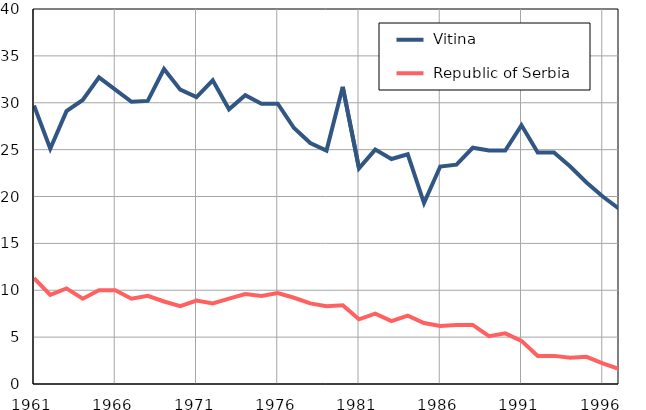
| Category |  Vitina |  Republic of Serbia |
|---|---|---|
| 1961.0 | 29.7 | 11.3 |
| 1962.0 | 25.1 | 9.5 |
| 1963.0 | 29.1 | 10.2 |
| 1964.0 | 30.3 | 9.1 |
| 1965.0 | 32.7 | 10 |
| 1966.0 | 31.4 | 10 |
| 1967.0 | 30.1 | 9.1 |
| 1968.0 | 30.2 | 9.4 |
| 1969.0 | 33.6 | 8.8 |
| 1970.0 | 31.4 | 8.3 |
| 1971.0 | 30.6 | 8.9 |
| 1972.0 | 32.4 | 8.6 |
| 1973.0 | 29.3 | 9.1 |
| 1974.0 | 30.8 | 9.6 |
| 1975.0 | 29.9 | 9.4 |
| 1976.0 | 29.9 | 9.7 |
| 1977.0 | 27.3 | 9.2 |
| 1978.0 | 25.7 | 8.6 |
| 1979.0 | 24.9 | 8.3 |
| 1980.0 | 31.7 | 8.4 |
| 1981.0 | 23 | 6.9 |
| 1982.0 | 25 | 7.5 |
| 1983.0 | 24 | 6.7 |
| 1984.0 | 24.5 | 7.3 |
| 1985.0 | 19.3 | 6.5 |
| 1986.0 | 23.2 | 6.2 |
| 1987.0 | 23.4 | 6.3 |
| 1988.0 | 25.2 | 6.3 |
| 1989.0 | 24.9 | 5.1 |
| 1990.0 | 24.9 | 5.4 |
| 1991.0 | 27.6 | 4.6 |
| 1992.0 | 24.7 | 3 |
| 1993.0 | 24.7 | 3 |
| 1994.0 | 23.2 | 2.8 |
| 1995.0 | 21.5 | 2.9 |
| 1996.0 | 20 | 2.2 |
| 1997.0 | 18.7 | 1.6 |